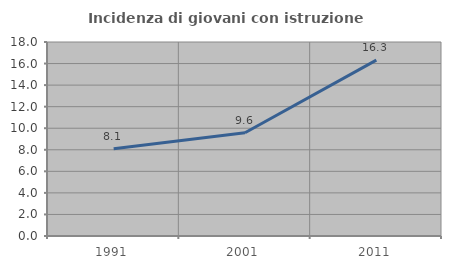
| Category | Incidenza di giovani con istruzione universitaria |
|---|---|
| 1991.0 | 8.088 |
| 2001.0 | 9.585 |
| 2011.0 | 16.318 |